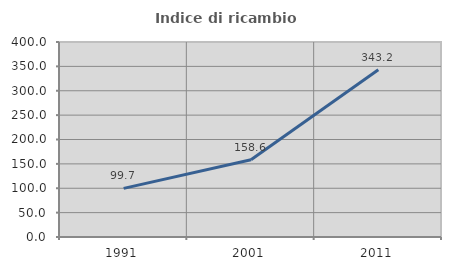
| Category | Indice di ricambio occupazionale  |
|---|---|
| 1991.0 | 99.682 |
| 2001.0 | 158.559 |
| 2011.0 | 343.182 |